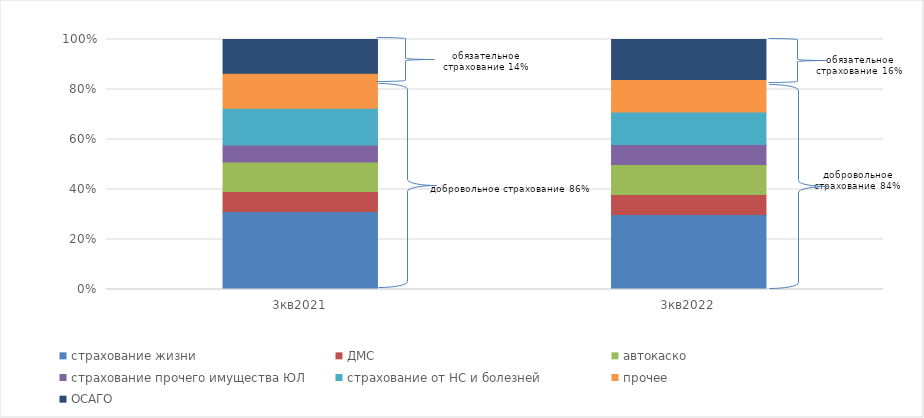
| Category | страхование жизни | ДМС | автокаско | страхование прочего имущества ЮЛ | страхование от НС и болезней | прочее | ОСАГО |
|---|---|---|---|---|---|---|---|
| 3кв2021 | 0.312 | 0.08 | 0.119 | 0.067 | 0.147 | 0.14 | 0.135 |
| 3кв2022 | 0.3 | 0.08 | 0.12 | 0.08 | 0.13 | 0.13 | 0.16 |